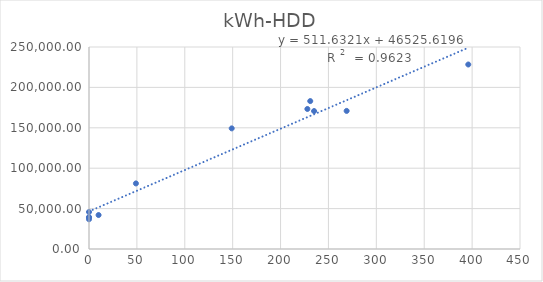
| Category | Series 0 |
|---|---|
| 396.0 | 228336 |
| 269.0 | 170897 |
| 235.0 | 170715 |
| 149.0 | 149295 |
| 49.0 | 81154 |
| 0.0 | 45805 |
| 0.0 | 39269 |
| 0.0 | 39357 |
| 0.0 | 36810 |
| 10.0 | 42039 |
| 228.0 | 173296 |
| 231.0 | 183062 |